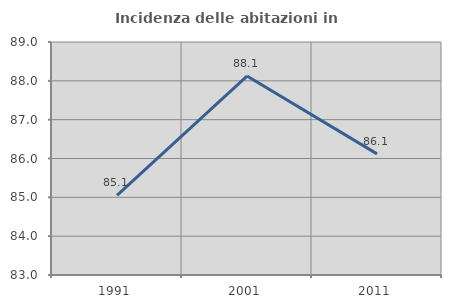
| Category | Incidenza delle abitazioni in proprietà  |
|---|---|
| 1991.0 | 85.052 |
| 2001.0 | 88.123 |
| 2011.0 | 86.119 |